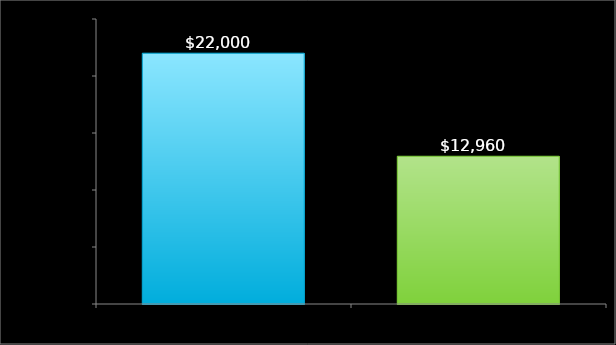
| Category | Series 0 |
|---|---|
| 0 | 22000 |
| 1 | 12960 |